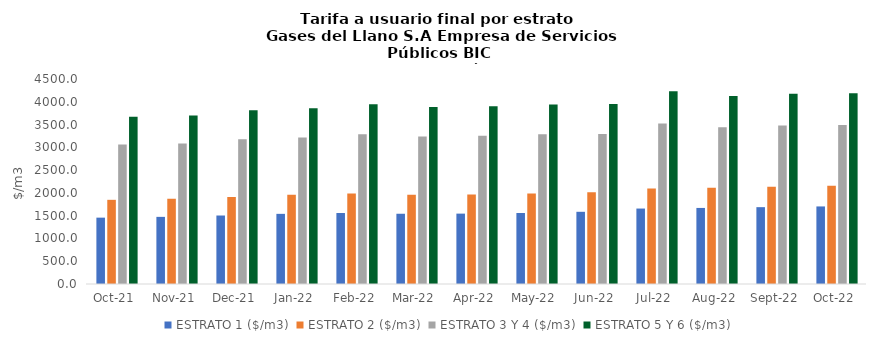
| Category | ESTRATO 1 ($/m3) | ESTRATO 2 ($/m3) | ESTRATO 3 Y 4 ($/m3) | ESTRATO 5 Y 6 ($/m3) |
|---|---|---|---|---|
| 2021-10-01 | 1456.51 | 1847.75 | 3061.72 | 3674.064 |
| 2021-11-01 | 1473.59 | 1868.74 | 3084.28 | 3701.136 |
| 2021-12-01 | 1503.37 | 1908.8 | 3176.73 | 3812.076 |
| 2022-01-01 | 1539.93 | 1960.98 | 3216.6 | 3859.92 |
| 2022-02-01 | 1558.18 | 1985.61 | 3289.23 | 3947.076 |
| 2022-03-01 | 1542.04 | 1958.44 | 3238.74 | 3886.488 |
| 2022-04-01 | 1544.93 | 1966.39 | 3252.39 | 3902.868 |
| 2022-05-01 | 1558.87 | 1984.13 | 3284.52 | 3941.424 |
| 2022-06-01 | 1584.89 | 2012.95 | 3290.9 | 3949.08 |
| 2022-07-01 | 1656.22 | 2098.37 | 3524.51 | 4229.412 |
| 2022-08-01 | 1669.64 | 2115.37 | 3440.02 | 4128.024 |
| 2022-09-01 | 1686.8 | 2137.11 | 3480.88 | 4177.056 |
| 2022-10-01 | 1702.57 | 2157.09 | 3487.76 | 4185.312 |